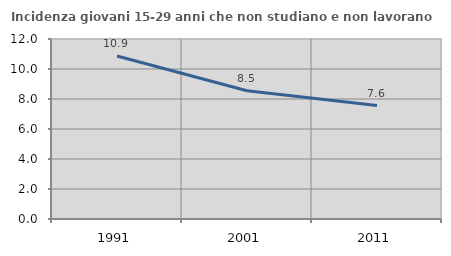
| Category | Incidenza giovani 15-29 anni che non studiano e non lavorano  |
|---|---|
| 1991.0 | 10.87 |
| 2001.0 | 8.549 |
| 2011.0 | 7.566 |